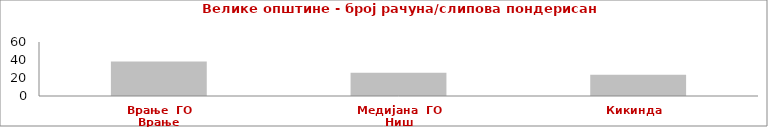
| Category | Series 0 |
|---|---|
| Врање  ГО Врање | 38.398 |
| Медијана  ГО Ниш | 25.961 |
| Кикинда   | 23.606 |